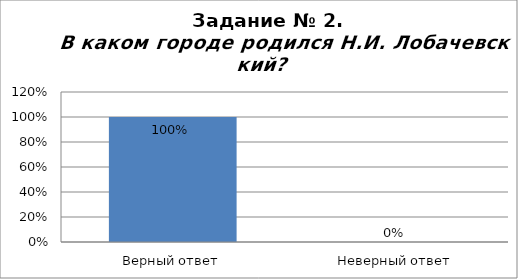
| Category | В каком городе родился Н.И. Лобачевский? |
|---|---|
| Верный ответ | 1 |
| Неверный ответ | 0 |